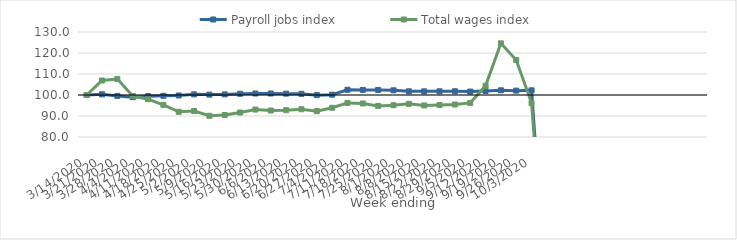
| Category | Payroll jobs index | Total wages index |
|---|---|---|
| 14/03/2020 | 100 | 100 |
| 21/03/2020 | 100.309 | 106.902 |
| 28/03/2020 | 99.557 | 107.609 |
| 04/04/2020 | 98.956 | 99.522 |
| 11/04/2020 | 99.451 | 98.011 |
| 18/04/2020 | 99.626 | 95.32 |
| 25/04/2020 | 99.776 | 91.987 |
| 02/05/2020 | 100.309 | 92.345 |
| 09/05/2020 | 100.182 | 90.105 |
| 16/05/2020 | 100.297 | 90.451 |
| 23/05/2020 | 100.58 | 91.656 |
| 30/05/2020 | 100.711 | 93.058 |
| 06/06/2020 | 100.712 | 92.624 |
| 13/06/2020 | 100.641 | 92.776 |
| 20/06/2020 | 100.565 | 93.214 |
| 27/06/2020 | 99.94 | 92.3 |
| 04/07/2020 | 100.152 | 93.913 |
| 11/07/2020 | 102.494 | 96.22 |
| 18/07/2020 | 102.43 | 95.961 |
| 25/07/2020 | 102.382 | 94.808 |
| 01/08/2020 | 102.235 | 95.143 |
| 08/08/2020 | 101.749 | 95.788 |
| 15/08/2020 | 101.736 | 95.021 |
| 22/08/2020 | 101.758 | 95.231 |
| 29/08/2020 | 101.785 | 95.467 |
| 05/09/2020 | 101.632 | 96.222 |
| 12/09/2020 | 101.934 | 104.353 |
| 19/09/2020 | 102.237 | 124.602 |
| 26/09/2020 | 102.078 | 116.624 |
| 03/10/2020 | 102.222 | 96.144 |